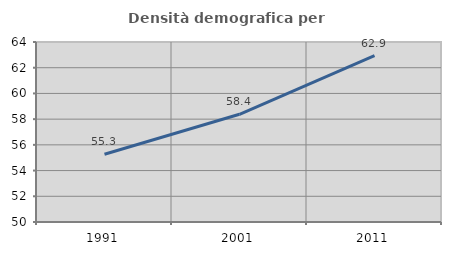
| Category | Densità demografica |
|---|---|
| 1991.0 | 55.266 |
| 2001.0 | 58.38 |
| 2011.0 | 62.932 |